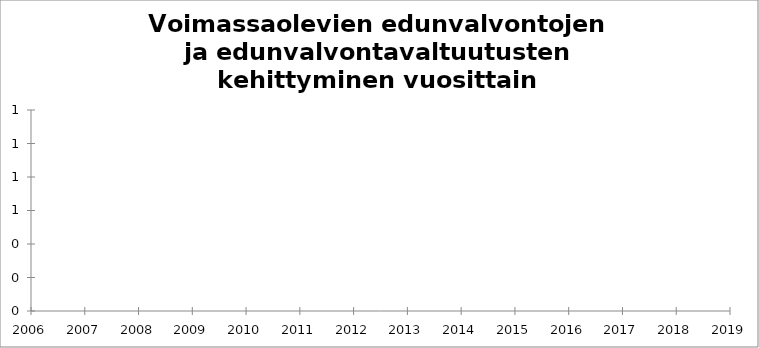
| Category | Series 0 |
|---|---|
| 2006 | 45778 |
| 2007 | 52598 |
| 2008 | 60646 |
| 2009 | 62599 |
| 2010 | 63192 |
| 2011 | 63525 |
| 2012 | 64001 |
| 2013 | 64722 |
| 2014 | 65860 |
| 2015 | 67111 |
| 2016 | 69216 |
| 2017 | 71877 |
| 2018 | 74695 |
| 2019 | 77463 |